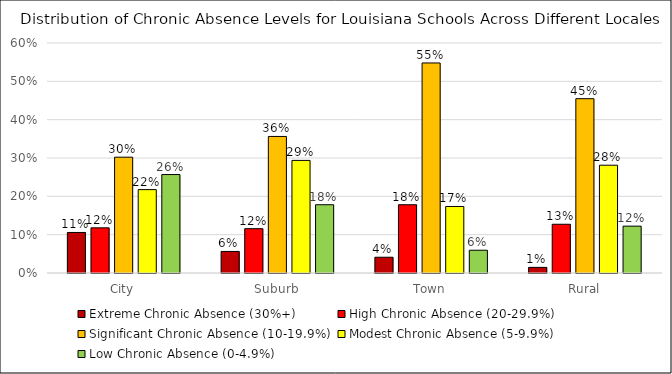
| Category | Extreme Chronic Absence (30%+) | High Chronic Absence (20-29.9%) | Significant Chronic Absence (10-19.9%) | Modest Chronic Absence (5-9.9%) | Low Chronic Absence (0-4.9%) |
|---|---|---|---|---|---|
| City | 0.106 | 0.118 | 0.302 | 0.218 | 0.257 |
| Suburb | 0.056 | 0.116 | 0.356 | 0.294 | 0.178 |
| Town | 0.041 | 0.178 | 0.548 | 0.174 | 0.059 |
| Rural | 0.015 | 0.127 | 0.455 | 0.281 | 0.122 |